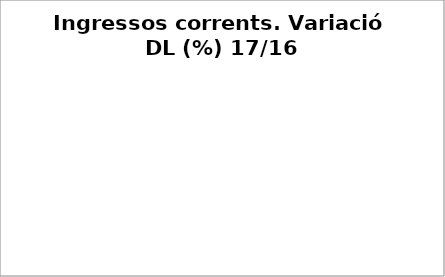
| Category | Series 0 |
|---|---|
| Impostos locals | 0.071 |
| Participació Tributs de l'Estat | 0 |
| Taxes i altres ingressos | -0.233 |
| Transferències corrents (exc. FCF) | 0.17 |
| Ingressos patrimonials | -0.264 |
| Ingressos corrents | 0.016 |